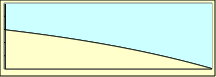
| Category | Aflossing | Rente |
|---|---|---|
| 0 | 429.01 | 625 |
| 1 | 430.083 | 623.927 |
| 2 | 431.158 | 622.852 |
| 3 | 432.236 | 621.774 |
| 4 | 433.316 | 620.694 |
| 5 | 434.4 | 619.61 |
| 6 | 435.486 | 618.524 |
| 7 | 436.574 | 617.436 |
| 8 | 437.666 | 616.344 |
| 9 | 438.76 | 615.25 |
| 10 | 439.857 | 614.153 |
| 11 | 440.956 | 613.054 |
| 12 | 442.059 | 611.951 |
| 13 | 443.164 | 610.846 |
| 14 | 444.272 | 609.738 |
| 15 | 445.383 | 608.628 |
| 16 | 446.496 | 607.514 |
| 17 | 447.612 | 606.398 |
| 18 | 448.731 | 605.279 |
| 19 | 449.853 | 604.157 |
| 20 | 450.978 | 603.032 |
| 21 | 452.105 | 601.905 |
| 22 | 453.235 | 600.775 |
| 23 | 454.369 | 599.642 |
| 24 | 455.504 | 598.506 |
| 25 | 456.643 | 597.367 |
| 26 | 457.785 | 596.225 |
| 27 | 458.929 | 595.081 |
| 28 | 460.077 | 593.933 |
| 29 | 461.227 | 592.783 |
| 30 | 462.38 | 591.63 |
| 31 | 463.536 | 590.474 |
| 32 | 464.695 | 589.315 |
| 33 | 465.856 | 588.154 |
| 34 | 467.021 | 586.989 |
| 35 | 468.189 | 585.821 |
| 36 | 469.359 | 584.651 |
| 37 | 470.532 | 583.478 |
| 38 | 471.709 | 582.301 |
| 39 | 472.888 | 581.122 |
| 40 | 474.07 | 579.94 |
| 41 | 475.255 | 578.755 |
| 42 | 476.444 | 577.566 |
| 43 | 477.635 | 576.375 |
| 44 | 478.829 | 575.181 |
| 45 | 480.026 | 573.984 |
| 46 | 481.226 | 572.784 |
| 47 | 482.429 | 571.581 |
| 48 | 483.635 | 570.375 |
| 49 | 484.844 | 569.166 |
| 50 | 486.056 | 567.954 |
| 51 | 487.271 | 566.739 |
| 52 | 488.49 | 565.52 |
| 53 | 489.711 | 564.299 |
| 54 | 490.935 | 563.075 |
| 55 | 492.162 | 561.848 |
| 56 | 493.393 | 560.617 |
| 57 | 494.626 | 559.384 |
| 58 | 495.863 | 558.147 |
| 59 | 497.103 | 556.908 |
| 60 | 498.345 | 555.665 |
| 61 | 499.591 | 554.419 |
| 62 | 500.84 | 553.17 |
| 63 | 502.092 | 551.918 |
| 64 | 503.347 | 550.663 |
| 65 | 504.606 | 549.404 |
| 66 | 505.867 | 548.143 |
| 67 | 507.132 | 546.878 |
| 68 | 508.4 | 545.61 |
| 69 | 509.671 | 544.339 |
| 70 | 510.945 | 543.065 |
| 71 | 512.222 | 541.788 |
| 72 | 513.503 | 540.507 |
| 73 | 514.787 | 539.223 |
| 74 | 516.074 | 537.936 |
| 75 | 517.364 | 536.646 |
| 76 | 518.657 | 535.353 |
| 77 | 519.954 | 534.056 |
| 78 | 521.254 | 532.756 |
| 79 | 522.557 | 531.453 |
| 80 | 523.863 | 530.147 |
| 81 | 525.173 | 528.837 |
| 82 | 526.486 | 527.524 |
| 83 | 527.802 | 526.208 |
| 84 | 529.122 | 524.888 |
| 85 | 530.444 | 523.566 |
| 86 | 531.771 | 522.24 |
| 87 | 533.1 | 520.91 |
| 88 | 534.433 | 519.577 |
| 89 | 535.769 | 518.241 |
| 90 | 537.108 | 516.902 |
| 91 | 538.451 | 515.559 |
| 92 | 539.797 | 514.213 |
| 93 | 541.147 | 512.863 |
| 94 | 542.5 | 511.511 |
| 95 | 543.856 | 510.154 |
| 96 | 545.215 | 508.795 |
| 97 | 546.578 | 507.432 |
| 98 | 547.945 | 506.065 |
| 99 | 549.315 | 504.695 |
| 100 | 550.688 | 503.322 |
| 101 | 552.065 | 501.945 |
| 102 | 553.445 | 500.565 |
| 103 | 554.829 | 499.182 |
| 104 | 556.216 | 497.794 |
| 105 | 557.606 | 496.404 |
| 106 | 559 | 495.01 |
| 107 | 560.398 | 493.612 |
| 108 | 561.799 | 492.211 |
| 109 | 563.203 | 490.807 |
| 110 | 564.611 | 489.399 |
| 111 | 566.023 | 487.987 |
| 112 | 567.438 | 486.572 |
| 113 | 568.856 | 485.154 |
| 114 | 570.278 | 483.732 |
| 115 | 571.704 | 482.306 |
| 116 | 573.133 | 480.877 |
| 117 | 574.566 | 479.444 |
| 118 | 576.003 | 478.007 |
| 119 | 577.443 | 476.567 |
| 120 | 578.886 | 475.124 |
| 121 | 580.333 | 473.677 |
| 122 | 581.784 | 472.226 |
| 123 | 583.239 | 470.771 |
| 124 | 584.697 | 469.313 |
| 125 | 586.159 | 467.851 |
| 126 | 587.624 | 466.386 |
| 127 | 589.093 | 464.917 |
| 128 | 590.566 | 463.444 |
| 129 | 592.042 | 461.968 |
| 130 | 593.522 | 460.488 |
| 131 | 595.006 | 459.004 |
| 132 | 596.494 | 457.516 |
| 133 | 597.985 | 456.025 |
| 134 | 599.48 | 454.53 |
| 135 | 600.979 | 453.032 |
| 136 | 602.481 | 451.529 |
| 137 | 603.987 | 450.023 |
| 138 | 605.497 | 448.513 |
| 139 | 607.011 | 446.999 |
| 140 | 608.528 | 445.482 |
| 141 | 610.05 | 443.96 |
| 142 | 611.575 | 442.435 |
| 143 | 613.104 | 440.906 |
| 144 | 614.637 | 439.373 |
| 145 | 616.173 | 437.837 |
| 146 | 617.714 | 436.296 |
| 147 | 619.258 | 434.752 |
| 148 | 620.806 | 433.204 |
| 149 | 622.358 | 431.652 |
| 150 | 623.914 | 430.096 |
| 151 | 625.474 | 428.536 |
| 152 | 627.037 | 426.973 |
| 153 | 628.605 | 425.405 |
| 154 | 630.177 | 423.834 |
| 155 | 631.752 | 422.258 |
| 156 | 633.331 | 420.679 |
| 157 | 634.915 | 419.095 |
| 158 | 636.502 | 417.508 |
| 159 | 638.093 | 415.917 |
| 160 | 639.688 | 414.322 |
| 161 | 641.288 | 412.722 |
| 162 | 642.891 | 411.119 |
| 163 | 644.498 | 409.512 |
| 164 | 646.109 | 407.901 |
| 165 | 647.725 | 406.285 |
| 166 | 649.344 | 404.666 |
| 167 | 650.967 | 403.043 |
| 168 | 652.595 | 401.415 |
| 169 | 654.226 | 399.784 |
| 170 | 655.862 | 398.148 |
| 171 | 657.501 | 396.509 |
| 172 | 659.145 | 394.865 |
| 173 | 660.793 | 393.217 |
| 174 | 662.445 | 391.565 |
| 175 | 664.101 | 389.909 |
| 176 | 665.761 | 388.249 |
| 177 | 667.426 | 386.584 |
| 178 | 669.094 | 384.916 |
| 179 | 670.767 | 383.243 |
| 180 | 672.444 | 381.566 |
| 181 | 674.125 | 379.885 |
| 182 | 675.81 | 378.2 |
| 183 | 677.5 | 376.51 |
| 184 | 679.194 | 374.816 |
| 185 | 680.892 | 373.118 |
| 186 | 682.594 | 371.416 |
| 187 | 684.3 | 369.71 |
| 188 | 686.011 | 367.999 |
| 189 | 687.726 | 366.284 |
| 190 | 689.446 | 364.565 |
| 191 | 691.169 | 362.841 |
| 192 | 692.897 | 361.113 |
| 193 | 694.629 | 359.381 |
| 194 | 696.366 | 357.644 |
| 195 | 698.107 | 355.903 |
| 196 | 699.852 | 354.158 |
| 197 | 701.602 | 352.408 |
| 198 | 703.356 | 350.654 |
| 199 | 705.114 | 348.896 |
| 200 | 706.877 | 347.133 |
| 201 | 708.644 | 345.366 |
| 202 | 710.416 | 343.594 |
| 203 | 712.192 | 341.818 |
| 204 | 713.972 | 340.038 |
| 205 | 715.757 | 338.253 |
| 206 | 717.546 | 336.464 |
| 207 | 719.34 | 334.67 |
| 208 | 721.139 | 332.871 |
| 209 | 722.942 | 331.069 |
| 210 | 724.749 | 329.261 |
| 211 | 726.561 | 327.449 |
| 212 | 728.377 | 325.633 |
| 213 | 730.198 | 323.812 |
| 214 | 732.024 | 321.986 |
| 215 | 733.854 | 320.156 |
| 216 | 735.688 | 318.322 |
| 217 | 737.528 | 316.483 |
| 218 | 739.371 | 314.639 |
| 219 | 741.22 | 312.79 |
| 220 | 743.073 | 310.937 |
| 221 | 744.931 | 309.08 |
| 222 | 746.793 | 307.217 |
| 223 | 748.66 | 305.35 |
| 224 | 750.531 | 303.479 |
| 225 | 752.408 | 301.602 |
| 226 | 754.289 | 299.721 |
| 227 | 756.175 | 297.836 |
| 228 | 758.065 | 295.945 |
| 229 | 759.96 | 294.05 |
| 230 | 761.86 | 292.15 |
| 231 | 763.765 | 290.245 |
| 232 | 765.674 | 288.336 |
| 233 | 767.588 | 286.422 |
| 234 | 769.507 | 284.503 |
| 235 | 771.431 | 282.579 |
| 236 | 773.36 | 280.65 |
| 237 | 775.293 | 278.717 |
| 238 | 777.231 | 276.779 |
| 239 | 779.174 | 274.836 |
| 240 | 781.122 | 272.888 |
| 241 | 783.075 | 270.935 |
| 242 | 785.033 | 268.977 |
| 243 | 786.995 | 267.015 |
| 244 | 788.963 | 265.047 |
| 245 | 790.935 | 263.075 |
| 246 | 792.913 | 261.098 |
| 247 | 794.895 | 259.115 |
| 248 | 796.882 | 257.128 |
| 249 | 798.874 | 255.136 |
| 250 | 800.871 | 253.139 |
| 251 | 802.874 | 251.136 |
| 252 | 804.881 | 249.129 |
| 253 | 806.893 | 247.117 |
| 254 | 808.91 | 245.1 |
| 255 | 810.933 | 243.078 |
| 256 | 812.96 | 241.05 |
| 257 | 814.992 | 239.018 |
| 258 | 817.03 | 236.98 |
| 259 | 819.072 | 234.938 |
| 260 | 821.12 | 232.89 |
| 261 | 823.173 | 230.837 |
| 262 | 825.231 | 228.779 |
| 263 | 827.294 | 226.716 |
| 264 | 829.362 | 224.648 |
| 265 | 831.435 | 222.575 |
| 266 | 833.514 | 220.496 |
| 267 | 835.598 | 218.412 |
| 268 | 837.687 | 216.323 |
| 269 | 839.781 | 214.229 |
| 270 | 841.88 | 212.13 |
| 271 | 843.985 | 210.025 |
| 272 | 846.095 | 207.915 |
| 273 | 848.21 | 205.8 |
| 274 | 850.331 | 203.679 |
| 275 | 852.457 | 201.553 |
| 276 | 854.588 | 199.422 |
| 277 | 856.724 | 197.286 |
| 278 | 858.866 | 195.144 |
| 279 | 861.013 | 192.997 |
| 280 | 863.166 | 190.844 |
| 281 | 865.324 | 188.686 |
| 282 | 867.487 | 186.523 |
| 283 | 869.656 | 184.354 |
| 284 | 871.83 | 182.18 |
| 285 | 874.01 | 180.001 |
| 286 | 876.195 | 177.816 |
| 287 | 878.385 | 175.625 |
| 288 | 880.581 | 173.429 |
| 289 | 882.782 | 171.228 |
| 290 | 884.989 | 169.021 |
| 291 | 887.202 | 166.808 |
| 292 | 889.42 | 164.59 |
| 293 | 891.643 | 162.367 |
| 294 | 893.873 | 160.138 |
| 295 | 896.107 | 157.903 |
| 296 | 898.347 | 155.663 |
| 297 | 900.593 | 153.417 |
| 298 | 902.845 | 151.165 |
| 299 | 905.102 | 148.908 |
| 300 | 907.365 | 146.645 |
| 301 | 909.633 | 144.377 |
| 302 | 911.907 | 142.103 |
| 303 | 914.187 | 139.823 |
| 304 | 916.472 | 137.538 |
| 305 | 918.764 | 135.246 |
| 306 | 921.061 | 132.95 |
| 307 | 923.363 | 130.647 |
| 308 | 925.672 | 128.338 |
| 309 | 927.986 | 126.024 |
| 310 | 930.306 | 123.704 |
| 311 | 932.632 | 121.379 |
| 312 | 934.963 | 119.047 |
| 313 | 937.3 | 116.71 |
| 314 | 939.644 | 114.366 |
| 315 | 941.993 | 112.017 |
| 316 | 944.348 | 109.662 |
| 317 | 946.709 | 107.301 |
| 318 | 949.075 | 104.935 |
| 319 | 951.448 | 102.562 |
| 320 | 953.827 | 100.183 |
| 321 | 956.211 | 97.799 |
| 322 | 958.602 | 95.408 |
| 323 | 960.998 | 93.012 |
| 324 | 963.401 | 90.609 |
| 325 | 965.809 | 88.201 |
| 326 | 968.224 | 85.786 |
| 327 | 970.644 | 83.366 |
| 328 | 973.071 | 80.939 |
| 329 | 975.504 | 78.506 |
| 330 | 977.943 | 76.068 |
| 331 | 980.387 | 73.623 |
| 332 | 982.838 | 71.172 |
| 333 | 985.295 | 68.715 |
| 334 | 987.759 | 66.251 |
| 335 | 990.228 | 63.782 |
| 336 | 992.704 | 61.306 |
| 337 | 995.185 | 58.825 |
| 338 | 997.673 | 56.337 |
| 339 | 1000.168 | 53.843 |
| 340 | 1002.668 | 51.342 |
| 341 | 1005.175 | 48.835 |
| 342 | 1007.688 | 46.323 |
| 343 | 1010.207 | 43.803 |
| 344 | 1012.732 | 41.278 |
| 345 | 1015.264 | 38.746 |
| 346 | 1017.802 | 36.208 |
| 347 | 1020.347 | 33.663 |
| 348 | 1022.898 | 31.112 |
| 349 | 1025.455 | 28.555 |
| 350 | 1028.019 | 25.992 |
| 351 | 1030.589 | 23.421 |
| 352 | 1033.165 | 20.845 |
| 353 | 1035.748 | 18.262 |
| 354 | 1038.337 | 15.673 |
| 355 | 1040.933 | 13.077 |
| 356 | 1043.536 | 10.475 |
| 357 | 1046.144 | 7.866 |
| 358 | 1048.76 | 5.25 |
| 359 | 1051.382 | 2.628 |